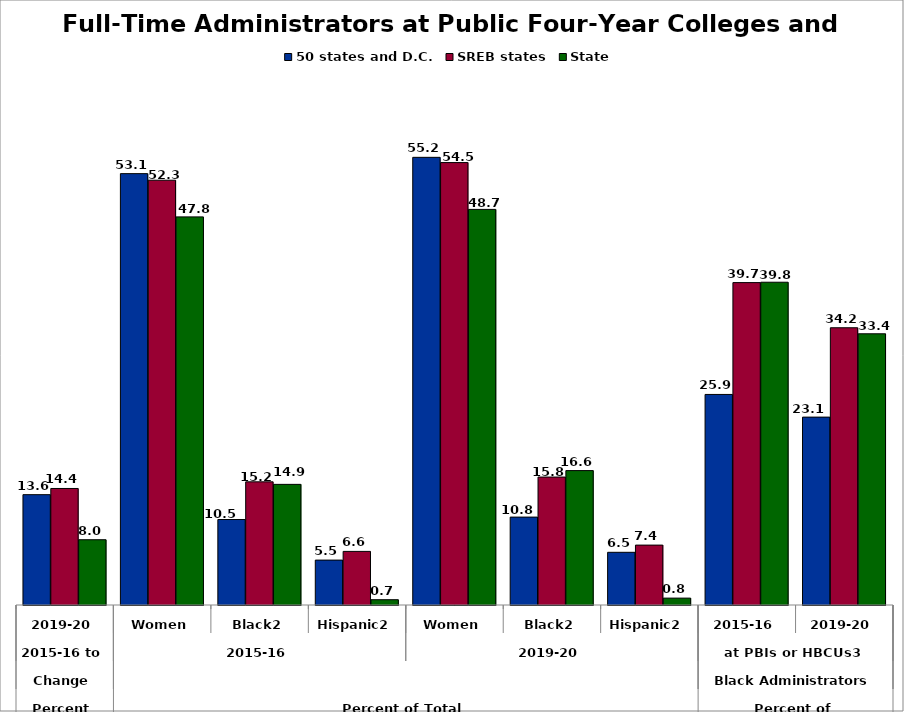
| Category | 50 states and D.C. | SREB states | State |
|---|---|---|---|
| 0 | 13.593 | 14.357 | 8.042 |
| 1 | 53.146 | 52.335 | 47.817 |
| 2 | 10.531 | 15.174 | 14.863 |
| 3 | 5.533 | 6.605 | 0.652 |
| 4 | 55.154 | 54.509 | 48.739 |
| 5 | 10.829 | 15.764 | 16.559 |
| 6 | 6.493 | 7.38 | 0.848 |
| 7 | 25.94 | 39.72 | 39.766 |
| 8 | 23.148 | 34.157 | 33.415 |